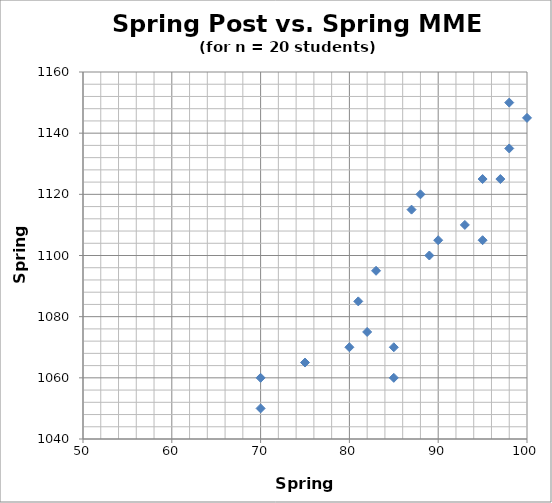
| Category | Spring Post vs. Spring MME |
|---|---|
| 95.0 | 1105 |
| 85.0 | 1060 |
| 75.0 | 1065 |
| 80.0 | 1070 |
| 97.0 | 1125 |
| 98.0 | 1135 |
| 89.0 | 1100 |
| 70.0 | 1050 |
| 98.0 | 1150 |
| 82.0 | 1075 |
| 100.0 | 1145 |
| 93.0 | 1110 |
| 90.0 | 1105 |
| 83.0 | 1095 |
| 81.0 | 1085 |
| 70.0 | 1060 |
| 85.0 | 1070 |
| 95.0 | 1125 |
| 88.0 | 1120 |
| 87.0 | 1115 |